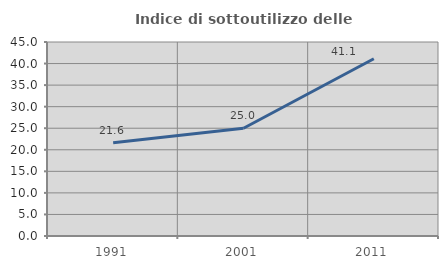
| Category | Indice di sottoutilizzo delle abitazioni  |
|---|---|
| 1991.0 | 21.649 |
| 2001.0 | 25 |
| 2011.0 | 41.117 |